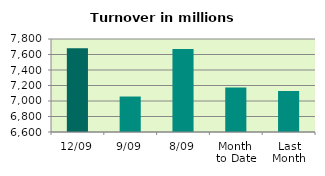
| Category | Series 0 |
|---|---|
| 12/09 | 7681.232 |
| 9/09 | 7057.731 |
| 8/09 | 7672.509 |
| Month 
to Date | 7173.632 |
| Last
Month | 7128.729 |